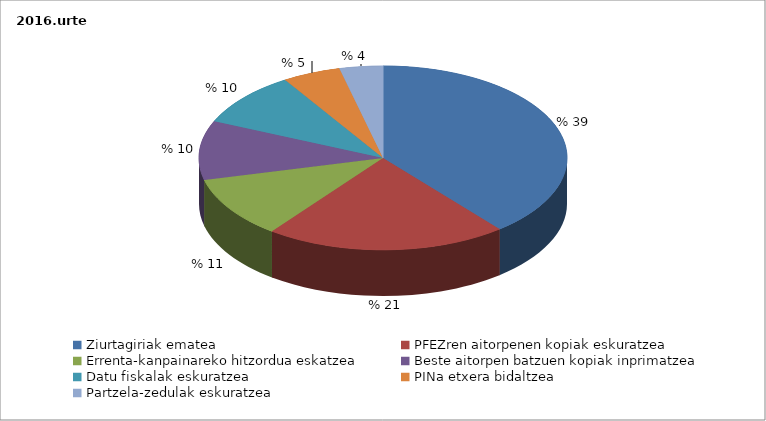
| Category | Series 0 |
|---|---|
| Ziurtagiriak ematea | 2533 |
| PFEZren aitorpenen kopiak eskuratzea | 1375 |
| Errenta-kanpainareko hitzordua eskatzea | 701 |
| Beste aitorpen batzuen kopiak inprimatzea | 675 |
| Datu fiskalak eskuratzea | 618 |
| PINa etxera bidaltzea | 331 |
| Partzela-zedulak eskuratzea | 247 |